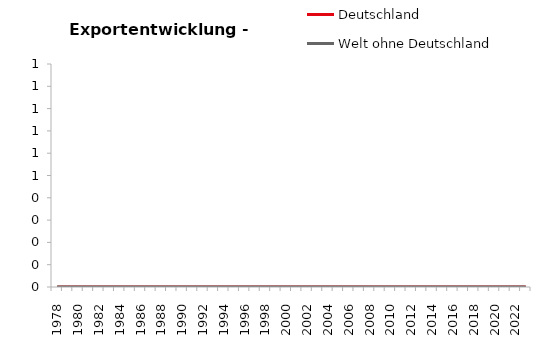
| Category | Deutschland | Welt ohne Deutschland | Series 2 | Series 3 |
|---|---|---|---|---|
| 1978.0 | 6.367 | 6.386 | 11.437 | 6.931 |
| 1979.0 | 7.762 | 7.356 | 13.003 | 8.208 |
| 1980.0 | 8.665 | 8.002 | 14.671 | 9.86 |
| 1981.0 | 9.107 | 9.13 | 14.796 | 10.787 |
| 1982.0 | 9.722 | 9.649 | 15.359 | 10.422 |
| 1983.0 | 10.602 | 9.813 | 16.458 | 10.746 |
| 1984.0 | 11.571 | 11.325 | 17.817 | 12.424 |
| 1985.0 | 13.244 | 12.655 | 20.076 | 13.427 |
| 1986.0 | 13.93 | 11.785 | 20.427 | 12.051 |
| 1987.0 | 14.816 | 11.418 | 20.71 | 12.126 |
| 1988.0 | 16.675 | 12.738 | 22.872 | 13.212 |
| 1989.0 | 18.406 | 14.384 | 25.555 | 15.304 |
| 1990.0 | 21.246 | 15.095 | 27.666 | 16.517 |
| 1991.0 | 23.229 | 14.941 | 28.984 | 17.788 |
| 1992.0 | 24.115 | 15.012 | 28.983 | 17.895 |
| 1993.0 | 22.639 | 14.577 | 26.656 | 17.443 |
| 1994.0 | 24.261 | 16.229 | 28.655 | 19.89 |
| 1995.0 | 27.635 | 18.293 | 33.145 | 19.875 |
| 1996.0 | 28.451 | 19.603 | 34.779 | 21.477 |
| 1997.0 | 31.161 | 23.748 | 37.484 | 24.31 |
| 1998.0 | 34.601 | 25.386 | 40.052 | 25.857 |
| 1999.0 | 35.989 | 27.605 | 42.883 | 27.532 |
| 2000.0 | 39.731 | 32.7 | 47.823 | 32.224 |
| 2001.0 | 41.296 | 35.265 | 49.964 | 33.958 |
| 2002.0 | 42.356 | 37.046 | 48.687 | 33.398 |
| 2003.0 | 42.887 | 37.884 | 51.983 | 34.693 |
| 2004.0 | 49.486 | 42.872 | 61.287 | 37.713 |
| 2005.0 | 51.463 | 45.477 | 63.796 | 40.472 |
| 2006.0 | 53.8 | 50.877 | 67.761 | 44.225 |
| 2007.0 | 58.879 | 56.486 | 74.392 | 48.449 |
| 2008.0 | 59.842 | 58.092 | 75.946 | 51.585 |
| 2009.0 | 49.875 | 45.451 | 62.378 | 41.91 |
| 2010.0 | 59.021 | 52.691 | 70.247 | 49.932 |
| 2011.0 | 65.024 | 58.948 | 78.39 | 58.755 |
| 2012.0 | 64.684 | 60.334 | 77.664 | 59.798 |
| 2013.0 | 64.736 | 61.91 | 76.776 | 59.284 |
| 2014.0 | 65.093 | 63.378 | 76.029 | 59.006 |
| 2015.0 | 67.477 | 64.812 | 77.126 | 61.17 |
| 2016.0 | 68.465 | 64.115 | 78.959 | 61.873 |
| 2017.0 | 73.267 | 69.75 | 85.201 | 67.598 |
| 2018.0 | 77.32 | 73.806 | 87.474 | 72.724 |
| 2019.0 | 76.974 | 76.363 | 86.496 | 74.456 |
| 2020.0 | 74.235 | 69.793 | 79.117 | 68.153 |
| 2021.0 | 85.336 | 81.426 | 92.642 | 86.579 |
| 2022.0 | 99.16 | 96.215 | 108.103 | 106.142 |
| 2023.0 | 100 | 100 | 100 | 100 |